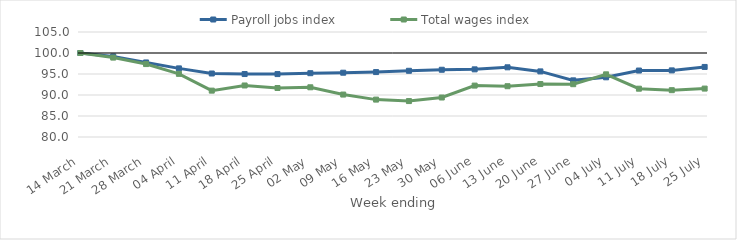
| Category | Payroll jobs index | Total wages index |
|---|---|---|
| 2020-03-14 | 100 | 100 |
| 2020-03-21 | 99.176 | 98.905 |
| 2020-03-28 | 97.75 | 97.365 |
| 2020-04-04 | 96.338 | 95.036 |
| 2020-04-11 | 95.117 | 91.038 |
| 2020-04-18 | 94.99 | 92.266 |
| 2020-04-25 | 94.981 | 91.663 |
| 2020-05-02 | 95.191 | 91.836 |
| 2020-05-09 | 95.308 | 90.104 |
| 2020-05-16 | 95.458 | 88.903 |
| 2020-05-23 | 95.765 | 88.553 |
| 2020-05-30 | 96.012 | 89.401 |
| 2020-06-06 | 96.107 | 92.236 |
| 2020-06-13 | 96.596 | 92.092 |
| 2020-06-20 | 95.619 | 92.61 |
| 2020-06-27 | 93.486 | 92.572 |
| 2020-07-04 | 94.212 | 94.918 |
| 2020-07-11 | 95.823 | 91.499 |
| 2020-07-18 | 95.861 | 91.148 |
| 2020-07-25 | 96.679 | 91.527 |